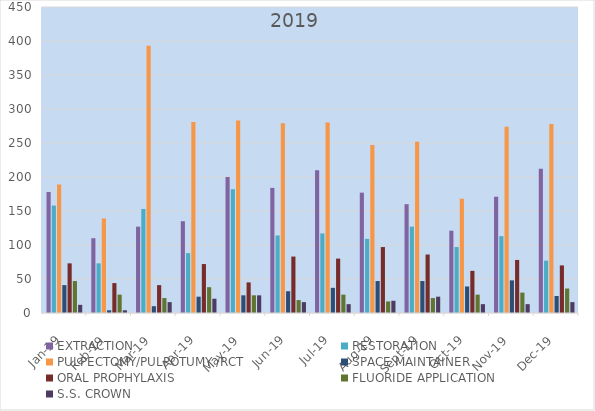
| Category | EXTRACTION | RESTORATION | PULPECTOMY/PULPOTUMY /RCT | SPACE MAINTAINER | ORAL PROPHYLAXIS | FLUORIDE APPLICATION | S.S. CROWN   |
|---|---|---|---|---|---|---|---|
| 2019-01-01 | 178 | 158 | 189 | 41 | 73 | 47 | 12 |
| 2019-02-01 | 110 | 73 | 139 | 4 | 44 | 27 | 4 |
| 2019-03-01 | 127 | 153 | 393 | 10 | 41 | 22 | 16 |
| 2019-04-01 | 135 | 88 | 281 | 24 | 72 | 38 | 21 |
| 2019-05-01 | 200 | 182 | 283 | 26 | 45 | 26 | 26 |
| 2019-06-01 | 184 | 114 | 279 | 32 | 83 | 19 | 16 |
| 2019-07-01 | 210 | 117 | 280 | 37 | 80 | 27 | 13 |
| 2019-08-01 | 177 | 109 | 247 | 47 | 97 | 17 | 18 |
| 2019-09-01 | 160 | 127 | 252 | 47 | 86 | 22 | 24 |
| 2019-10-01 | 121 | 97 | 168 | 39 | 62 | 27 | 13 |
| 2019-11-01 | 171 | 113 | 274 | 48 | 78 | 30 | 13 |
| 2019-12-01 | 212 | 77 | 278 | 25 | 70 | 36 | 16 |